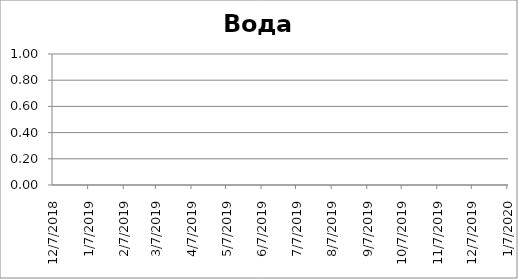
| Category | Вода |
|---|---|
| 12/7/18 | 0 |
| 12/13/18 | 0 |
| 12/19/18 | 0 |
| 12/25/18 | 0 |
| 12/31/18 | 0 |
| 1/6/19 | 0 |
| 1/12/19 | 0 |
| 1/18/19 | 0 |
| 1/24/19 | 0 |
| 1/30/19 | 0 |
| 2/5/19 | 0 |
| 2/11/19 | 0 |
| 2/17/19 | 0 |
| 2/23/19 | 0 |
| 3/1/19 | 0 |
| 3/7/19 | 0 |
| 3/13/19 | 0 |
| 3/19/19 | 0 |
| 3/25/19 | 0 |
| 3/31/19 | 0 |
| 4/6/19 | 0 |
| 4/12/19 | 0 |
| 4/18/19 | 0 |
| 4/24/19 | 0 |
| 4/30/19 | 0 |
| 5/6/19 | 0 |
| 5/12/19 | 0 |
| 5/18/19 | 0 |
| 5/24/19 | 0 |
| 5/30/19 | 0 |
| 6/5/19 | 0 |
| 6/11/19 | 0 |
| 6/17/19 | 0 |
| 6/23/19 | 0 |
| 6/29/19 | 0 |
| 7/5/19 | 0 |
| 7/11/19 | 0 |
| 7/17/19 | 0 |
| 7/23/19 | 0 |
| 7/29/19 | 0 |
| 8/4/19 | 0 |
| 8/10/19 | 0 |
| 8/16/19 | 0 |
| 8/22/19 | 0 |
| 8/28/19 | 0 |
| 9/3/19 | 0 |
| 9/9/19 | 0 |
| 9/15/19 | 0 |
| 9/21/19 | 0 |
| 9/27/19 | 0 |
| 10/3/19 | 0 |
| 10/9/19 | 0 |
| 10/15/19 | 0 |
| 10/21/19 | 0 |
| 10/27/19 | 0 |
| 11/2/19 | 0 |
| 11/8/19 | 0 |
| 11/14/19 | 0 |
| 11/20/19 | 0 |
| 11/26/19 | 0 |
| 12/2/19 | 0 |
| 12/8/19 | 0 |
| 12/14/19 | 0 |
| 12/20/19 | 0 |
| 12/26/19 | 0 |
| 1/1/20 | 0 |
| 1/7/20 | 0 |